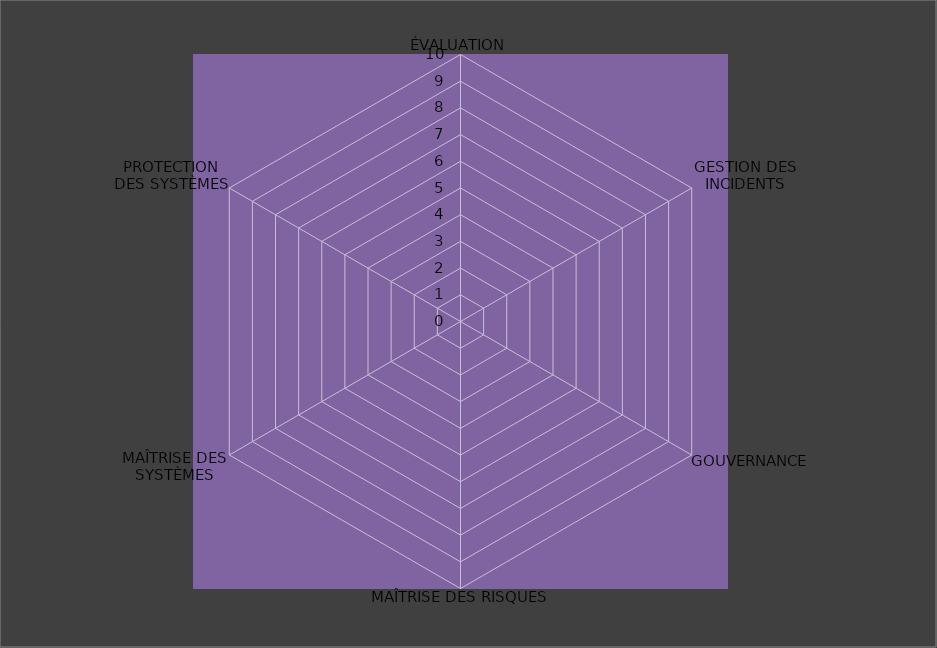
| Category | Année 2027 |
|---|---|
| ÉVALUATION | 0 |
| GESTION DES INCIDENTS | 0 |
| GOUVERNANCE | 0 |
| MAÎTRISE DES RISQUES | 0 |
| MAÎTRISE DES SYSTÈMES | 0 |
| PROTECTION
DES SYSTÈMES | 0 |